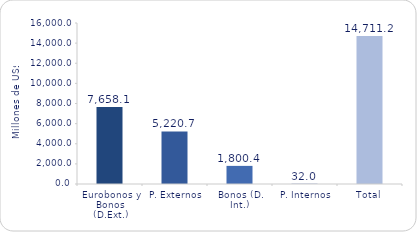
| Category | Series 1 |
|---|---|
| Eurobonos y Bonos (D.Ext.) | 7658.1 |
| P. Externos | 5220.7 |
| Bonos (D. Int.) | 1800.4 |
| P. Internos | 32 |
| Total | 14711.2 |